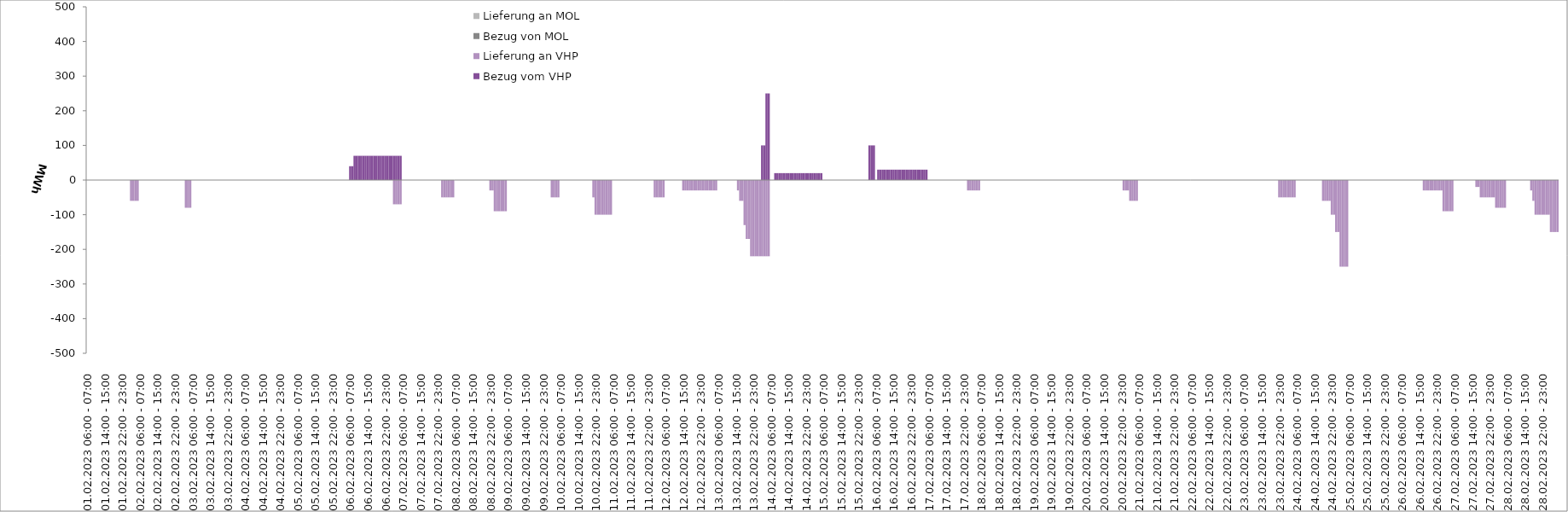
| Category | Bezug vom VHP | Lieferung an VHP | Bezug von MOL | Lieferung an MOL |
|---|---|---|---|---|
| 01.02.2023 06:00 - 07:00 | 0 | 0 | 0 | 0 |
| 01.02.2023 07:00 - 08:00 | 0 | 0 | 0 | 0 |
| 01.02.2023 08:00 - 09:00 | 0 | 0 | 0 | 0 |
| 01.02.2023 09:00 - 10:00 | 0 | 0 | 0 | 0 |
| 01.02.2023 10:00 - 11:00 | 0 | 0 | 0 | 0 |
| 01.02.2023 11:00 - 12:00 | 0 | 0 | 0 | 0 |
| 01.02.2023 12:00 - 13:00 | 0 | 0 | 0 | 0 |
| 01.02.2023 13:00 - 14:00 | 0 | 0 | 0 | 0 |
| 01.02.2023 14:00 - 15:00 | 0 | 0 | 0 | 0 |
| 01.02.2023 15:00 - 16:00 | 0 | 0 | 0 | 0 |
| 01.02.2023 16:00 - 17:00 | 0 | 0 | 0 | 0 |
| 01.02.2023 17:00 - 18:00 | 0 | 0 | 0 | 0 |
| 01.02.2023 18:00 - 19:00 | 0 | 0 | 0 | 0 |
| 01.02.2023 19:00 - 20:00 | 0 | 0 | 0 | 0 |
| 01.02.2023 20:00 - 21:00 | 0 | 0 | 0 | 0 |
| 01.02.2023 21:00 - 22:00 | 0 | 0 | 0 | 0 |
| 01.02.2023 22:00 - 23:00 | 0 | 0 | 0 | 0 |
| 01.02.2023 23:00 - 24:00 | 0 | 0 | 0 | 0 |
| 02.02.2023 00:00 - 01:00 | 0 | 0 | 0 | 0 |
| 02.02.2023 01:00 - 02:00 | 0 | 0 | 0 | 0 |
| 02.02.2023 02:00 - 03:00 | 0 | -60 | 0 | 0 |
| 02.02.2023 03:00 - 04:00 | 0 | -60 | 0 | 0 |
| 02.02.2023 04:00 - 05:00 | 0 | -60 | 0 | 0 |
| 02.02.2023 05:00 - 06:00 | 0 | -60 | 0 | 0 |
| 02.02.2023 06:00 - 07:00 | 0 | 0 | 0 | 0 |
| 02.02.2023 07:00 - 08:00 | 0 | 0 | 0 | 0 |
| 02.02.2023 08:00 - 09:00 | 0 | 0 | 0 | 0 |
| 02.02.2023 09:00 - 10:00 | 0 | 0 | 0 | 0 |
| 02.02.2023 10:00 - 11:00 | 0 | 0 | 0 | 0 |
| 02.02.2023 11:00 - 12:00 | 0 | 0 | 0 | 0 |
| 02.02.2023 12:00 - 13:00 | 0 | 0 | 0 | 0 |
| 02.02.2023 13:00 - 14:00 | 0 | 0 | 0 | 0 |
| 02.02.2023 14:00 - 15:00 | 0 | 0 | 0 | 0 |
| 02.02.2023 15:00 - 16:00 | 0 | 0 | 0 | 0 |
| 02.02.2023 16:00 - 17:00 | 0 | 0 | 0 | 0 |
| 02.02.2023 17:00 - 18:00 | 0 | 0 | 0 | 0 |
| 02.02.2023 18:00 - 19:00 | 0 | 0 | 0 | 0 |
| 02.02.2023 19:00 - 20:00 | 0 | 0 | 0 | 0 |
| 02.02.2023 20:00 - 21:00 | 0 | 0 | 0 | 0 |
| 02.02.2023 21:00 - 22:00 | 0 | 0 | 0 | 0 |
| 02.02.2023 22:00 - 23:00 | 0 | 0 | 0 | 0 |
| 02.02.2023 23:00 - 24:00 | 0 | 0 | 0 | 0 |
| 03.02.2023 00:00 - 01:00 | 0 | 0 | 0 | 0 |
| 03.02.2023 01:00 - 02:00 | 0 | 0 | 0 | 0 |
| 03.02.2023 02:00 - 03:00 | 0 | 0 | 0 | 0 |
| 03.02.2023 03:00 - 04:00 | 0 | -80 | 0 | 0 |
| 03.02.2023 04:00 - 05:00 | 0 | -80 | 0 | 0 |
| 03.02.2023 05:00 - 06:00 | 0 | -80 | 0 | 0 |
| 03.02.2023 06:00 - 07:00 | 0 | 0 | 0 | 0 |
| 03.02.2023 07:00 - 08:00 | 0 | 0 | 0 | 0 |
| 03.02.2023 08:00 - 09:00 | 0 | 0 | 0 | 0 |
| 03.02.2023 09:00 - 10:00 | 0 | 0 | 0 | 0 |
| 03.02.2023 10:00 - 11:00 | 0 | 0 | 0 | 0 |
| 03.02.2023 11:00 - 12:00 | 0 | 0 | 0 | 0 |
| 03.02.2023 12:00 - 13:00 | 0 | 0 | 0 | 0 |
| 03.02.2023 13:00 - 14:00 | 0 | 0 | 0 | 0 |
| 03.02.2023 14:00 - 15:00 | 0 | 0 | 0 | 0 |
| 03.02.2023 15:00 - 16:00 | 0 | 0 | 0 | 0 |
| 03.02.2023 16:00 - 17:00 | 0 | 0 | 0 | 0 |
| 03.02.2023 17:00 - 18:00 | 0 | 0 | 0 | 0 |
| 03.02.2023 18:00 - 19:00 | 0 | 0 | 0 | 0 |
| 03.02.2023 19:00 - 20:00 | 0 | 0 | 0 | 0 |
| 03.02.2023 20:00 - 21:00 | 0 | 0 | 0 | 0 |
| 03.02.2023 21:00 - 22:00 | 0 | 0 | 0 | 0 |
| 03.02.2023 22:00 - 23:00 | 0 | 0 | 0 | 0 |
| 03.02.2023 23:00 - 24:00 | 0 | 0 | 0 | 0 |
| 04.02.2023 00:00 - 01:00 | 0 | 0 | 0 | 0 |
| 04.02.2023 01:00 - 02:00 | 0 | 0 | 0 | 0 |
| 04.02.2023 02:00 - 03:00 | 0 | 0 | 0 | 0 |
| 04.02.2023 03:00 - 04:00 | 0 | 0 | 0 | 0 |
| 04.02.2023 04:00 - 05:00 | 0 | 0 | 0 | 0 |
| 04.02.2023 05:00 - 06:00 | 0 | 0 | 0 | 0 |
| 04.02.2023 06:00 - 07:00 | 0 | 0 | 0 | 0 |
| 04.02.2023 07:00 - 08:00 | 0 | 0 | 0 | 0 |
| 04.02.2023 08:00 - 09:00 | 0 | 0 | 0 | 0 |
| 04.02.2023 09:00 - 10:00 | 0 | 0 | 0 | 0 |
| 04.02.2023 10:00 - 11:00 | 0 | 0 | 0 | 0 |
| 04.02.2023 11:00 - 12:00 | 0 | 0 | 0 | 0 |
| 04.02.2023 12:00 - 13:00 | 0 | 0 | 0 | 0 |
| 04.02.2023 13:00 - 14:00 | 0 | 0 | 0 | 0 |
| 04.02.2023 14:00 - 15:00 | 0 | 0 | 0 | 0 |
| 04.02.2023 15:00 - 16:00 | 0 | 0 | 0 | 0 |
| 04.02.2023 16:00 - 17:00 | 0 | 0 | 0 | 0 |
| 04.02.2023 17:00 - 18:00 | 0 | 0 | 0 | 0 |
| 04.02.2023 18:00 - 19:00 | 0 | 0 | 0 | 0 |
| 04.02.2023 19:00 - 20:00 | 0 | 0 | 0 | 0 |
| 04.02.2023 20:00 - 21:00 | 0 | 0 | 0 | 0 |
| 04.02.2023 21:00 - 22:00 | 0 | 0 | 0 | 0 |
| 04.02.2023 22:00 - 23:00 | 0 | 0 | 0 | 0 |
| 04.02.2023 23:00 - 24:00 | 0 | 0 | 0 | 0 |
| 05.02.2023 00:00 - 01:00 | 0 | 0 | 0 | 0 |
| 05.02.2023 01:00 - 02:00 | 0 | 0 | 0 | 0 |
| 05.02.2023 02:00 - 03:00 | 0 | 0 | 0 | 0 |
| 05.02.2023 03:00 - 04:00 | 0 | 0 | 0 | 0 |
| 05.02.2023 04:00 - 05:00 | 0 | 0 | 0 | 0 |
| 05.02.2023 05:00 - 06:00 | 0 | 0 | 0 | 0 |
| 05.02.2023 06:00 - 07:00 | 0 | 0 | 0 | 0 |
| 05.02.2023 07:00 - 08:00 | 0 | 0 | 0 | 0 |
| 05.02.2023 08:00 - 09:00 | 0 | 0 | 0 | 0 |
| 05.02.2023 09:00 - 10:00 | 0 | 0 | 0 | 0 |
| 05.02.2023 10:00 - 11:00 | 0 | 0 | 0 | 0 |
| 05.02.2023 11:00 - 12:00 | 0 | 0 | 0 | 0 |
| 05.02.2023 12:00 - 13:00 | 0 | 0 | 0 | 0 |
| 05.02.2023 13:00 - 14:00 | 0 | 0 | 0 | 0 |
| 05.02.2023 14:00 - 15:00 | 0 | 0 | 0 | 0 |
| 05.02.2023 15:00 - 16:00 | 0 | 0 | 0 | 0 |
| 05.02.2023 16:00 - 17:00 | 0 | 0 | 0 | 0 |
| 05.02.2023 17:00 - 18:00 | 0 | 0 | 0 | 0 |
| 05.02.2023 18:00 - 19:00 | 0 | 0 | 0 | 0 |
| 05.02.2023 19:00 - 20:00 | 0 | 0 | 0 | 0 |
| 05.02.2023 20:00 - 21:00 | 0 | 0 | 0 | 0 |
| 05.02.2023 21:00 - 22:00 | 0 | 0 | 0 | 0 |
| 05.02.2023 22:00 - 23:00 | 0 | 0 | 0 | 0 |
| 05.02.2023 23:00 - 24:00 | 0 | 0 | 0 | 0 |
| 06.02.2023 00:00 - 01:00 | 0 | 0 | 0 | 0 |
| 06.02.2023 01:00 - 02:00 | 0 | 0 | 0 | 0 |
| 06.02.2023 02:00 - 03:00 | 0 | 0 | 0 | 0 |
| 06.02.2023 03:00 - 04:00 | 0 | 0 | 0 | 0 |
| 06.02.2023 04:00 - 05:00 | 0 | 0 | 0 | 0 |
| 06.02.2023 05:00 - 06:00 | 0 | 0 | 0 | 0 |
| 06.02.2023 06:00 - 07:00 | 40 | 0 | 0 | 0 |
| 06.02.2023 07:00 - 08:00 | 40 | 0 | 0 | 0 |
| 06.02.2023 08:00 - 09:00 | 70 | 0 | 0 | 0 |
| 06.02.2023 09:00 - 10:00 | 70 | 0 | 0 | 0 |
| 06.02.2023 10:00 - 11:00 | 70 | 0 | 0 | 0 |
| 06.02.2023 11:00 - 12:00 | 70 | 0 | 0 | 0 |
| 06.02.2023 12:00 - 13:00 | 70 | 0 | 0 | 0 |
| 06.02.2023 13:00 - 14:00 | 70 | 0 | 0 | 0 |
| 06.02.2023 14:00 - 15:00 | 70 | 0 | 0 | 0 |
| 06.02.2023 15:00 - 16:00 | 70 | 0 | 0 | 0 |
| 06.02.2023 16:00 - 17:00 | 70 | 0 | 0 | 0 |
| 06.02.2023 17:00 - 18:00 | 70 | 0 | 0 | 0 |
| 06.02.2023 18:00 - 19:00 | 70 | 0 | 0 | 0 |
| 06.02.2023 19:00 - 20:00 | 70 | 0 | 0 | 0 |
| 06.02.2023 20:00 - 21:00 | 70 | 0 | 0 | 0 |
| 06.02.2023 21:00 - 22:00 | 70 | 0 | 0 | 0 |
| 06.02.2023 22:00 - 23:00 | 70 | 0 | 0 | 0 |
| 06.02.2023 23:00 - 24:00 | 70 | 0 | 0 | 0 |
| 07.02.2023 00:00 - 01:00 | 70 | 0 | 0 | 0 |
| 07.02.2023 01:00 - 02:00 | 70 | 0 | 0 | 0 |
| 07.02.2023 02:00 - 03:00 | 70 | -70 | 0 | 0 |
| 07.02.2023 03:00 - 04:00 | 70 | -70 | 0 | 0 |
| 07.02.2023 04:00 - 05:00 | 70 | -70 | 0 | 0 |
| 07.02.2023 05:00 - 06:00 | 70 | -70 | 0 | 0 |
| 07.02.2023 06:00 - 07:00 | 0 | 0 | 0 | 0 |
| 07.02.2023 07:00 - 08:00 | 0 | 0 | 0 | 0 |
| 07.02.2023 08:00 - 09:00 | 0 | 0 | 0 | 0 |
| 07.02.2023 09:00 - 10:00 | 0 | 0 | 0 | 0 |
| 07.02.2023 10:00 - 11:00 | 0 | 0 | 0 | 0 |
| 07.02.2023 11:00 - 12:00 | 0 | 0 | 0 | 0 |
| 07.02.2023 12:00 - 13:00 | 0 | 0 | 0 | 0 |
| 07.02.2023 13:00 - 14:00 | 0 | 0 | 0 | 0 |
| 07.02.2023 14:00 - 15:00 | 0 | 0 | 0 | 0 |
| 07.02.2023 15:00 - 16:00 | 0 | 0 | 0 | 0 |
| 07.02.2023 16:00 - 17:00 | 0 | 0 | 0 | 0 |
| 07.02.2023 17:00 - 18:00 | 0 | 0 | 0 | 0 |
| 07.02.2023 18:00 - 19:00 | 0 | 0 | 0 | 0 |
| 07.02.2023 19:00 - 20:00 | 0 | 0 | 0 | 0 |
| 07.02.2023 20:00 - 21:00 | 0 | 0 | 0 | 0 |
| 07.02.2023 21:00 - 22:00 | 0 | 0 | 0 | 0 |
| 07.02.2023 22:00 - 23:00 | 0 | 0 | 0 | 0 |
| 07.02.2023 23:00 - 24:00 | 0 | 0 | 0 | 0 |
| 08.02.2023 00:00 - 01:00 | 0 | -50 | 0 | 0 |
| 08.02.2023 01:00 - 02:00 | 0 | -50 | 0 | 0 |
| 08.02.2023 02:00 - 03:00 | 0 | -50 | 0 | 0 |
| 08.02.2023 03:00 - 04:00 | 0 | -50 | 0 | 0 |
| 08.02.2023 04:00 - 05:00 | 0 | -50 | 0 | 0 |
| 08.02.2023 05:00 - 06:00 | 0 | -50 | 0 | 0 |
| 08.02.2023 06:00 - 07:00 | 0 | 0 | 0 | 0 |
| 08.02.2023 07:00 - 08:00 | 0 | 0 | 0 | 0 |
| 08.02.2023 08:00 - 09:00 | 0 | 0 | 0 | 0 |
| 08.02.2023 09:00 - 10:00 | 0 | 0 | 0 | 0 |
| 08.02.2023 10:00 - 11:00 | 0 | 0 | 0 | 0 |
| 08.02.2023 11:00 - 12:00 | 0 | 0 | 0 | 0 |
| 08.02.2023 12:00 - 13:00 | 0 | 0 | 0 | 0 |
| 08.02.2023 13:00 - 14:00 | 0 | 0 | 0 | 0 |
| 08.02.2023 14:00 - 15:00 | 0 | 0 | 0 | 0 |
| 08.02.2023 15:00 - 16:00 | 0 | 0 | 0 | 0 |
| 08.02.2023 16:00 - 17:00 | 0 | 0 | 0 | 0 |
| 08.02.2023 17:00 - 18:00 | 0 | 0 | 0 | 0 |
| 08.02.2023 18:00 - 19:00 | 0 | 0 | 0 | 0 |
| 08.02.2023 19:00 - 20:00 | 0 | 0 | 0 | 0 |
| 08.02.2023 20:00 - 21:00 | 0 | 0 | 0 | 0 |
| 08.02.2023 21:00 - 22:00 | 0 | 0 | 0 | 0 |
| 08.02.2023 22:00 - 23:00 | 0 | -30 | 0 | 0 |
| 08.02.2023 23:00 - 24:00 | 0 | -30 | 0 | 0 |
| 09.02.2023 00:00 - 01:00 | 0 | -90 | 0 | 0 |
| 09.02.2023 01:00 - 02:00 | 0 | -90 | 0 | 0 |
| 09.02.2023 02:00 - 03:00 | 0 | -90 | 0 | 0 |
| 09.02.2023 03:00 - 04:00 | 0 | -90 | 0 | 0 |
| 09.02.2023 04:00 - 05:00 | 0 | -90 | 0 | 0 |
| 09.02.2023 05:00 - 06:00 | 0 | -90 | 0 | 0 |
| 09.02.2023 06:00 - 07:00 | 0 | 0 | 0 | 0 |
| 09.02.2023 07:00 - 08:00 | 0 | 0 | 0 | 0 |
| 09.02.2023 08:00 - 09:00 | 0 | 0 | 0 | 0 |
| 09.02.2023 09:00 - 10:00 | 0 | 0 | 0 | 0 |
| 09.02.2023 10:00 - 11:00 | 0 | 0 | 0 | 0 |
| 09.02.2023 11:00 - 12:00 | 0 | 0 | 0 | 0 |
| 09.02.2023 12:00 - 13:00 | 0 | 0 | 0 | 0 |
| 09.02.2023 13:00 - 14:00 | 0 | 0 | 0 | 0 |
| 09.02.2023 14:00 - 15:00 | 0 | 0 | 0 | 0 |
| 09.02.2023 15:00 - 16:00 | 0 | 0 | 0 | 0 |
| 09.02.2023 16:00 - 17:00 | 0 | 0 | 0 | 0 |
| 09.02.2023 17:00 - 18:00 | 0 | 0 | 0 | 0 |
| 09.02.2023 18:00 - 19:00 | 0 | 0 | 0 | 0 |
| 09.02.2023 19:00 - 20:00 | 0 | 0 | 0 | 0 |
| 09.02.2023 20:00 - 21:00 | 0 | 0 | 0 | 0 |
| 09.02.2023 21:00 - 22:00 | 0 | 0 | 0 | 0 |
| 09.02.2023 22:00 - 23:00 | 0 | 0 | 0 | 0 |
| 09.02.2023 23:00 - 24:00 | 0 | 0 | 0 | 0 |
| 10.02.2023 00:00 - 01:00 | 0 | 0 | 0 | 0 |
| 10.02.2023 01:00 - 02:00 | 0 | 0 | 0 | 0 |
| 10.02.2023 02:00 - 03:00 | 0 | -50 | 0 | 0 |
| 10.02.2023 03:00 - 04:00 | 0 | -50 | 0 | 0 |
| 10.02.2023 04:00 - 05:00 | 0 | -50 | 0 | 0 |
| 10.02.2023 05:00 - 06:00 | 0 | -50 | 0 | 0 |
| 10.02.2023 06:00 - 07:00 | 0 | 0 | 0 | 0 |
| 10.02.2023 07:00 - 08:00 | 0 | 0 | 0 | 0 |
| 10.02.2023 08:00 - 09:00 | 0 | 0 | 0 | 0 |
| 10.02.2023 09:00 - 10:00 | 0 | 0 | 0 | 0 |
| 10.02.2023 10:00 - 11:00 | 0 | 0 | 0 | 0 |
| 10.02.2023 11:00 - 12:00 | 0 | 0 | 0 | 0 |
| 10.02.2023 12:00 - 13:00 | 0 | 0 | 0 | 0 |
| 10.02.2023 13:00 - 14:00 | 0 | 0 | 0 | 0 |
| 10.02.2023 14:00 - 15:00 | 0 | 0 | 0 | 0 |
| 10.02.2023 15:00 - 16:00 | 0 | 0 | 0 | 0 |
| 10.02.2023 16:00 - 17:00 | 0 | 0 | 0 | 0 |
| 10.02.2023 17:00 - 18:00 | 0 | 0 | 0 | 0 |
| 10.02.2023 18:00 - 19:00 | 0 | 0 | 0 | 0 |
| 10.02.2023 19:00 - 20:00 | 0 | 0 | 0 | 0 |
| 10.02.2023 20:00 - 21:00 | 0 | 0 | 0 | 0 |
| 10.02.2023 21:00 - 22:00 | 0 | -50 | 0 | 0 |
| 10.02.2023 22:00 - 23:00 | 0 | -100 | 0 | 0 |
| 10.02.2023 23:00 - 24:00 | 0 | -100 | 0 | 0 |
| 11.02.2023 00:00 - 01:00 | 0 | -100 | 0 | 0 |
| 11.02.2023 01:00 - 02:00 | 0 | -100 | 0 | 0 |
| 11.02.2023 02:00 - 03:00 | 0 | -100 | 0 | 0 |
| 11.02.2023 03:00 - 04:00 | 0 | -100 | 0 | 0 |
| 11.02.2023 04:00 - 05:00 | 0 | -100 | 0 | 0 |
| 11.02.2023 05:00 - 06:00 | 0 | -100 | 0 | 0 |
| 11.02.2023 06:00 - 07:00 | 0 | 0 | 0 | 0 |
| 11.02.2023 07:00 - 08:00 | 0 | 0 | 0 | 0 |
| 11.02.2023 08:00 - 09:00 | 0 | 0 | 0 | 0 |
| 11.02.2023 09:00 - 10:00 | 0 | 0 | 0 | 0 |
| 11.02.2023 10:00 - 11:00 | 0 | 0 | 0 | 0 |
| 11.02.2023 11:00 - 12:00 | 0 | 0 | 0 | 0 |
| 11.02.2023 12:00 - 13:00 | 0 | 0 | 0 | 0 |
| 11.02.2023 13:00 - 14:00 | 0 | 0 | 0 | 0 |
| 11.02.2023 14:00 - 15:00 | 0 | 0 | 0 | 0 |
| 11.02.2023 15:00 - 16:00 | 0 | 0 | 0 | 0 |
| 11.02.2023 16:00 - 17:00 | 0 | 0 | 0 | 0 |
| 11.02.2023 17:00 - 18:00 | 0 | 0 | 0 | 0 |
| 11.02.2023 18:00 - 19:00 | 0 | 0 | 0 | 0 |
| 11.02.2023 19:00 - 20:00 | 0 | 0 | 0 | 0 |
| 11.02.2023 20:00 - 21:00 | 0 | 0 | 0 | 0 |
| 11.02.2023 21:00 - 22:00 | 0 | 0 | 0 | 0 |
| 11.02.2023 22:00 - 23:00 | 0 | 0 | 0 | 0 |
| 11.02.2023 23:00 - 24:00 | 0 | 0 | 0 | 0 |
| 12.02.2023 00:00 - 01:00 | 0 | 0 | 0 | 0 |
| 12.02.2023 01:00 - 02:00 | 0 | -50 | 0 | 0 |
| 12.02.2023 02:00 - 03:00 | 0 | -50 | 0 | 0 |
| 12.02.2023 03:00 - 04:00 | 0 | -50 | 0 | 0 |
| 12.02.2023 04:00 - 05:00 | 0 | -50 | 0 | 0 |
| 12.02.2023 05:00 - 06:00 | 0 | -50 | 0 | 0 |
| 12.02.2023 06:00 - 07:00 | 0 | 0 | 0 | 0 |
| 12.02.2023 07:00 - 08:00 | 0 | 0 | 0 | 0 |
| 12.02.2023 08:00 - 09:00 | 0 | 0 | 0 | 0 |
| 12.02.2023 09:00 - 10:00 | 0 | 0 | 0 | 0 |
| 12.02.2023 10:00 - 11:00 | 0 | 0 | 0 | 0 |
| 12.02.2023 11:00 - 12:00 | 0 | 0 | 0 | 0 |
| 12.02.2023 12:00 - 13:00 | 0 | 0 | 0 | 0 |
| 12.02.2023 13:00 - 14:00 | 0 | 0 | 0 | 0 |
| 12.02.2023 14:00 - 15:00 | 0 | -30 | 0 | 0 |
| 12.02.2023 15:00 - 16:00 | 0 | -30 | 0 | 0 |
| 12.02.2023 16:00 - 17:00 | 0 | -30 | 0 | 0 |
| 12.02.2023 17:00 - 18:00 | 0 | -30 | 0 | 0 |
| 12.02.2023 18:00 - 19:00 | 0 | -30 | 0 | 0 |
| 12.02.2023 19:00 - 20:00 | 0 | -30 | 0 | 0 |
| 12.02.2023 20:00 - 21:00 | 0 | -30 | 0 | 0 |
| 12.02.2023 21:00 - 22:00 | 0 | -30 | 0 | 0 |
| 12.02.2023 22:00 - 23:00 | 0 | -30 | 0 | 0 |
| 12.02.2023 23:00 - 24:00 | 0 | -30 | 0 | 0 |
| 13.02.2023 00:00 - 01:00 | 0 | -30 | 0 | 0 |
| 13.02.2023 01:00 - 02:00 | 0 | -30 | 0 | 0 |
| 13.02.2023 02:00 - 03:00 | 0 | -30 | 0 | 0 |
| 13.02.2023 03:00 - 04:00 | 0 | -30 | 0 | 0 |
| 13.02.2023 04:00 - 05:00 | 0 | -30 | 0 | 0 |
| 13.02.2023 05:00 - 06:00 | 0 | -30 | 0 | 0 |
| 13.02.2023 06:00 - 07:00 | 0 | 0 | 0 | 0 |
| 13.02.2023 07:00 - 08:00 | 0 | 0 | 0 | 0 |
| 13.02.2023 08:00 - 09:00 | 0 | 0 | 0 | 0 |
| 13.02.2023 09:00 - 10:00 | 0 | 0 | 0 | 0 |
| 13.02.2023 10:00 - 11:00 | 0 | 0 | 0 | 0 |
| 13.02.2023 11:00 - 12:00 | 0 | 0 | 0 | 0 |
| 13.02.2023 12:00 - 13:00 | 0 | 0 | 0 | 0 |
| 13.02.2023 13:00 - 14:00 | 0 | 0 | 0 | 0 |
| 13.02.2023 14:00 - 15:00 | 0 | 0 | 0 | 0 |
| 13.02.2023 15:00 - 16:00 | 0 | -30 | 0 | 0 |
| 13.02.2023 16:00 - 17:00 | 0 | -60 | 0 | 0 |
| 13.02.2023 17:00 - 18:00 | 0 | -60 | 0 | 0 |
| 13.02.2023 18:00 - 19:00 | 0 | -130 | 0 | 0 |
| 13.02.2023 19:00 - 20:00 | 0 | -170 | 0 | 0 |
| 13.02.2023 20:00 - 21:00 | 0 | -170 | 0 | 0 |
| 13.02.2023 21:00 - 22:00 | 0 | -220 | 0 | 0 |
| 13.02.2023 22:00 - 23:00 | 0 | -220 | 0 | 0 |
| 13.02.2023 23:00 - 24:00 | 0 | -220 | 0 | 0 |
| 14.02.2023 00:00 - 01:00 | 0 | -220 | 0 | 0 |
| 14.02.2023 01:00 - 02:00 | 0 | -220 | 0 | 0 |
| 14.02.2023 02:00 - 03:00 | 100 | -220 | 0 | 0 |
| 14.02.2023 03:00 - 04:00 | 100 | -220 | 0 | 0 |
| 14.02.2023 04:00 - 05:00 | 250 | -220 | 0 | 0 |
| 14.02.2023 05:00 - 06:00 | 250 | -220 | 0 | 0 |
| 14.02.2023 06:00 - 07:00 | 0 | 0 | 0 | 0 |
| 14.02.2023 07:00 - 08:00 | 0 | 0 | 0 | 0 |
| 14.02.2023 08:00 - 09:00 | 20 | 0 | 0 | 0 |
| 14.02.2023 09:00 - 10:00 | 20 | 0 | 0 | 0 |
| 14.02.2023 10:00 - 11:00 | 20 | 0 | 0 | 0 |
| 14.02.2023 11:00 - 12:00 | 20 | 0 | 0 | 0 |
| 14.02.2023 12:00 - 13:00 | 20 | 0 | 0 | 0 |
| 14.02.2023 13:00 - 14:00 | 20 | 0 | 0 | 0 |
| 14.02.2023 14:00 - 15:00 | 20 | 0 | 0 | 0 |
| 14.02.2023 15:00 - 16:00 | 20 | 0 | 0 | 0 |
| 14.02.2023 16:00 - 17:00 | 20 | 0 | 0 | 0 |
| 14.02.2023 17:00 - 18:00 | 20 | 0 | 0 | 0 |
| 14.02.2023 18:00 - 19:00 | 20 | 0 | 0 | 0 |
| 14.02.2023 19:00 - 20:00 | 20 | 0 | 0 | 0 |
| 14.02.2023 20:00 - 21:00 | 20 | 0 | 0 | 0 |
| 14.02.2023 21:00 - 22:00 | 20 | 0 | 0 | 0 |
| 14.02.2023 22:00 - 23:00 | 20 | 0 | 0 | 0 |
| 14.02.2023 23:00 - 24:00 | 20 | 0 | 0 | 0 |
| 15.02.2023 00:00 - 01:00 | 20 | 0 | 0 | 0 |
| 15.02.2023 01:00 - 02:00 | 20 | 0 | 0 | 0 |
| 15.02.2023 02:00 - 03:00 | 20 | 0 | 0 | 0 |
| 15.02.2023 03:00 - 04:00 | 20 | 0 | 0 | 0 |
| 15.02.2023 04:00 - 05:00 | 20 | 0 | 0 | 0 |
| 15.02.2023 05:00 - 06:00 | 20 | 0 | 0 | 0 |
| 15.02.2023 06:00 - 07:00 | 0 | 0 | 0 | 0 |
| 15.02.2023 07:00 - 08:00 | 0 | 0 | 0 | 0 |
| 15.02.2023 08:00 - 09:00 | 0 | 0 | 0 | 0 |
| 15.02.2023 09:00 - 10:00 | 0 | 0 | 0 | 0 |
| 15.02.2023 10:00 - 11:00 | 0 | 0 | 0 | 0 |
| 15.02.2023 11:00 - 12:00 | 0 | 0 | 0 | 0 |
| 15.02.2023 12:00 - 13:00 | 0 | 0 | 0 | 0 |
| 15.02.2023 13:00 - 14:00 | 0 | 0 | 0 | 0 |
| 15.02.2023 14:00 - 15:00 | 0 | 0 | 0 | 0 |
| 15.02.2023 15:00 - 16:00 | 0 | 0 | 0 | 0 |
| 15.02.2023 16:00 - 17:00 | 0 | 0 | 0 | 0 |
| 15.02.2023 17:00 - 18:00 | 0 | 0 | 0 | 0 |
| 15.02.2023 18:00 - 19:00 | 0 | 0 | 0 | 0 |
| 15.02.2023 19:00 - 20:00 | 0 | 0 | 0 | 0 |
| 15.02.2023 20:00 - 21:00 | 0 | 0 | 0 | 0 |
| 15.02.2023 21:00 - 22:00 | 0 | 0 | 0 | 0 |
| 15.02.2023 22:00 - 23:00 | 0 | 0 | 0 | 0 |
| 15.02.2023 23:00 - 24:00 | 0 | 0 | 0 | 0 |
| 16.02.2023 00:00 - 01:00 | 0 | 0 | 0 | 0 |
| 16.02.2023 01:00 - 02:00 | 0 | 0 | 0 | 0 |
| 16.02.2023 02:00 - 03:00 | 0 | 0 | 0 | 0 |
| 16.02.2023 03:00 - 04:00 | 100 | 0 | 0 | 0 |
| 16.02.2023 04:00 - 05:00 | 100 | 0 | 0 | 0 |
| 16.02.2023 05:00 - 06:00 | 100 | 0 | 0 | 0 |
| 16.02.2023 06:00 - 07:00 | 0 | 0 | 0 | 0 |
| 16.02.2023 07:00 - 08:00 | 30 | 0 | 0 | 0 |
| 16.02.2023 08:00 - 09:00 | 30 | 0 | 0 | 0 |
| 16.02.2023 09:00 - 10:00 | 30 | 0 | 0 | 0 |
| 16.02.2023 10:00 - 11:00 | 30 | 0 | 0 | 0 |
| 16.02.2023 11:00 - 12:00 | 30 | 0 | 0 | 0 |
| 16.02.2023 12:00 - 13:00 | 30 | 0 | 0 | 0 |
| 16.02.2023 13:00 - 14:00 | 30 | 0 | 0 | 0 |
| 16.02.2023 14:00 - 15:00 | 30 | 0 | 0 | 0 |
| 16.02.2023 15:00 - 16:00 | 30 | 0 | 0 | 0 |
| 16.02.2023 16:00 - 17:00 | 30 | 0 | 0 | 0 |
| 16.02.2023 17:00 - 18:00 | 30 | 0 | 0 | 0 |
| 16.02.2023 18:00 - 19:00 | 30 | 0 | 0 | 0 |
| 16.02.2023 19:00 - 20:00 | 30 | 0 | 0 | 0 |
| 16.02.2023 20:00 - 21:00 | 30 | 0 | 0 | 0 |
| 16.02.2023 21:00 - 22:00 | 30 | 0 | 0 | 0 |
| 16.02.2023 22:00 - 23:00 | 30 | 0 | 0 | 0 |
| 16.02.2023 23:00 - 24:00 | 30 | 0 | 0 | 0 |
| 17.02.2023 00:00 - 01:00 | 30 | 0 | 0 | 0 |
| 17.02.2023 01:00 - 02:00 | 30 | 0 | 0 | 0 |
| 17.02.2023 02:00 - 03:00 | 30 | 0 | 0 | 0 |
| 17.02.2023 03:00 - 04:00 | 30 | 0 | 0 | 0 |
| 17.02.2023 04:00 - 05:00 | 30 | 0 | 0 | 0 |
| 17.02.2023 05:00 - 06:00 | 30 | 0 | 0 | 0 |
| 17.02.2023 06:00 - 07:00 | 0 | 0 | 0 | 0 |
| 17.02.2023 07:00 - 08:00 | 0 | 0 | 0 | 0 |
| 17.02.2023 08:00 - 09:00 | 0 | 0 | 0 | 0 |
| 17.02.2023 09:00 - 10:00 | 0 | 0 | 0 | 0 |
| 17.02.2023 10:00 - 11:00 | 0 | 0 | 0 | 0 |
| 17.02.2023 11:00 - 12:00 | 0 | 0 | 0 | 0 |
| 17.02.2023 12:00 - 13:00 | 0 | 0 | 0 | 0 |
| 17.02.2023 13:00 - 14:00 | 0 | 0 | 0 | 0 |
| 17.02.2023 14:00 - 15:00 | 0 | 0 | 0 | 0 |
| 17.02.2023 15:00 - 16:00 | 0 | 0 | 0 | 0 |
| 17.02.2023 16:00 - 17:00 | 0 | 0 | 0 | 0 |
| 17.02.2023 17:00 - 18:00 | 0 | 0 | 0 | 0 |
| 17.02.2023 18:00 - 19:00 | 0 | 0 | 0 | 0 |
| 17.02.2023 19:00 - 20:00 | 0 | 0 | 0 | 0 |
| 17.02.2023 20:00 - 21:00 | 0 | 0 | 0 | 0 |
| 17.02.2023 21:00 - 22:00 | 0 | 0 | 0 | 0 |
| 17.02.2023 22:00 - 23:00 | 0 | 0 | 0 | 0 |
| 17.02.2023 23:00 - 24:00 | 0 | 0 | 0 | 0 |
| 18.02.2023 00:00 - 01:00 | 0 | -30 | 0 | 0 |
| 18.02.2023 01:00 - 02:00 | 0 | -30 | 0 | 0 |
| 18.02.2023 02:00 - 03:00 | 0 | -30 | 0 | 0 |
| 18.02.2023 03:00 - 04:00 | 0 | -30 | 0 | 0 |
| 18.02.2023 04:00 - 05:00 | 0 | -30 | 0 | 0 |
| 18.02.2023 05:00 - 06:00 | 0 | -30 | 0 | 0 |
| 18.02.2023 06:00 - 07:00 | 0 | 0 | 0 | 0 |
| 18.02.2023 07:00 - 08:00 | 0 | 0 | 0 | 0 |
| 18.02.2023 08:00 - 09:00 | 0 | 0 | 0 | 0 |
| 18.02.2023 09:00 - 10:00 | 0 | 0 | 0 | 0 |
| 18.02.2023 10:00 - 11:00 | 0 | 0 | 0 | 0 |
| 18.02.2023 11:00 - 12:00 | 0 | 0 | 0 | 0 |
| 18.02.2023 12:00 - 13:00 | 0 | 0 | 0 | 0 |
| 18.02.2023 13:00 - 14:00 | 0 | 0 | 0 | 0 |
| 18.02.2023 14:00 - 15:00 | 0 | 0 | 0 | 0 |
| 18.02.2023 15:00 - 16:00 | 0 | 0 | 0 | 0 |
| 18.02.2023 16:00 - 17:00 | 0 | 0 | 0 | 0 |
| 18.02.2023 17:00 - 18:00 | 0 | 0 | 0 | 0 |
| 18.02.2023 18:00 - 19:00 | 0 | 0 | 0 | 0 |
| 18.02.2023 19:00 - 20:00 | 0 | 0 | 0 | 0 |
| 18.02.2023 20:00 - 21:00 | 0 | 0 | 0 | 0 |
| 18.02.2023 21:00 - 22:00 | 0 | 0 | 0 | 0 |
| 18.02.2023 22:00 - 23:00 | 0 | 0 | 0 | 0 |
| 18.02.2023 23:00 - 24:00 | 0 | 0 | 0 | 0 |
| 19.02.2023 00:00 - 01:00 | 0 | 0 | 0 | 0 |
| 19.02.2023 01:00 - 02:00 | 0 | 0 | 0 | 0 |
| 19.02.2023 02:00 - 03:00 | 0 | 0 | 0 | 0 |
| 19.02.2023 03:00 - 04:00 | 0 | 0 | 0 | 0 |
| 19.02.2023 04:00 - 05:00 | 0 | 0 | 0 | 0 |
| 19.02.2023 05:00 - 06:00 | 0 | 0 | 0 | 0 |
| 19.02.2023 06:00 - 07:00 | 0 | 0 | 0 | 0 |
| 19.02.2023 07:00 - 08:00 | 0 | 0 | 0 | 0 |
| 19.02.2023 08:00 - 09:00 | 0 | 0 | 0 | 0 |
| 19.02.2023 09:00 - 10:00 | 0 | 0 | 0 | 0 |
| 19.02.2023 10:00 - 11:00 | 0 | 0 | 0 | 0 |
| 19.02.2023 11:00 - 12:00 | 0 | 0 | 0 | 0 |
| 19.02.2023 12:00 - 13:00 | 0 | 0 | 0 | 0 |
| 19.02.2023 13:00 - 14:00 | 0 | 0 | 0 | 0 |
| 19.02.2023 14:00 - 15:00 | 0 | 0 | 0 | 0 |
| 19.02.2023 15:00 - 16:00 | 0 | 0 | 0 | 0 |
| 19.02.2023 16:00 - 17:00 | 0 | 0 | 0 | 0 |
| 19.02.2023 17:00 - 18:00 | 0 | 0 | 0 | 0 |
| 19.02.2023 18:00 - 19:00 | 0 | 0 | 0 | 0 |
| 19.02.2023 19:00 - 20:00 | 0 | 0 | 0 | 0 |
| 19.02.2023 20:00 - 21:00 | 0 | 0 | 0 | 0 |
| 19.02.2023 21:00 - 22:00 | 0 | 0 | 0 | 0 |
| 19.02.2023 22:00 - 23:00 | 0 | 0 | 0 | 0 |
| 19.02.2023 23:00 - 24:00 | 0 | 0 | 0 | 0 |
| 20.02.2023 00:00 - 01:00 | 0 | 0 | 0 | 0 |
| 20.02.2023 01:00 - 02:00 | 0 | 0 | 0 | 0 |
| 20.02.2023 02:00 - 03:00 | 0 | 0 | 0 | 0 |
| 20.02.2023 03:00 - 04:00 | 0 | 0 | 0 | 0 |
| 20.02.2023 04:00 - 05:00 | 0 | 0 | 0 | 0 |
| 20.02.2023 05:00 - 06:00 | 0 | 0 | 0 | 0 |
| 20.02.2023 06:00 - 07:00 | 0 | 0 | 0 | 0 |
| 20.02.2023 07:00 - 08:00 | 0 | 0 | 0 | 0 |
| 20.02.2023 08:00 - 09:00 | 0 | 0 | 0 | 0 |
| 20.02.2023 09:00 - 10:00 | 0 | 0 | 0 | 0 |
| 20.02.2023 10:00 - 11:00 | 0 | 0 | 0 | 0 |
| 20.02.2023 11:00 - 12:00 | 0 | 0 | 0 | 0 |
| 20.02.2023 12:00 - 13:00 | 0 | 0 | 0 | 0 |
| 20.02.2023 13:00 - 14:00 | 0 | 0 | 0 | 0 |
| 20.02.2023 14:00 - 15:00 | 0 | 0 | 0 | 0 |
| 20.02.2023 15:00 - 16:00 | 0 | 0 | 0 | 0 |
| 20.02.2023 16:00 - 17:00 | 0 | 0 | 0 | 0 |
| 20.02.2023 17:00 - 18:00 | 0 | 0 | 0 | 0 |
| 20.02.2023 18:00 - 19:00 | 0 | 0 | 0 | 0 |
| 20.02.2023 19:00 - 20:00 | 0 | 0 | 0 | 0 |
| 20.02.2023 20:00 - 21:00 | 0 | 0 | 0 | 0 |
| 20.02.2023 21:00 - 22:00 | 0 | 0 | 0 | 0 |
| 20.02.2023 22:00 - 23:00 | 0 | 0 | 0 | 0 |
| 20.02.2023 23:00 - 24:00 | 0 | -30 | 0 | 0 |
| 21.02.2023 00:00 - 01:00 | 0 | -30 | 0 | 0 |
| 21.02.2023 01:00 - 02:00 | 0 | -30 | 0 | 0 |
| 21.02.2023 02:00 - 03:00 | 0 | -60 | 0 | 0 |
| 21.02.2023 03:00 - 04:00 | 0 | -60 | 0 | 0 |
| 21.02.2023 04:00 - 05:00 | 0 | -60 | 0 | 0 |
| 21.02.2023 05:00 - 06:00 | 0 | -60 | 0 | 0 |
| 21.02.2023 06:00 - 07:00 | 0 | 0 | 0 | 0 |
| 21.02.2023 07:00 - 08:00 | 0 | 0 | 0 | 0 |
| 21.02.2023 08:00 - 09:00 | 0 | 0 | 0 | 0 |
| 21.02.2023 09:00 - 10:00 | 0 | 0 | 0 | 0 |
| 21.02.2023 10:00 - 11:00 | 0 | 0 | 0 | 0 |
| 21.02.2023 11:00 - 12:00 | 0 | 0 | 0 | 0 |
| 21.02.2023 12:00 - 13:00 | 0 | 0 | 0 | 0 |
| 21.02.2023 13:00 - 14:00 | 0 | 0 | 0 | 0 |
| 21.02.2023 14:00 - 15:00 | 0 | 0 | 0 | 0 |
| 21.02.2023 15:00 - 16:00 | 0 | 0 | 0 | 0 |
| 21.02.2023 16:00 - 17:00 | 0 | 0 | 0 | 0 |
| 21.02.2023 17:00 - 18:00 | 0 | 0 | 0 | 0 |
| 21.02.2023 18:00 - 19:00 | 0 | 0 | 0 | 0 |
| 21.02.2023 19:00 - 20:00 | 0 | 0 | 0 | 0 |
| 21.02.2023 20:00 - 21:00 | 0 | 0 | 0 | 0 |
| 21.02.2023 21:00 - 22:00 | 0 | 0 | 0 | 0 |
| 21.02.2023 22:00 - 23:00 | 0 | 0 | 0 | 0 |
| 21.02.2023 23:00 - 24:00 | 0 | 0 | 0 | 0 |
| 22.02.2023 00:00 - 01:00 | 0 | 0 | 0 | 0 |
| 22.02.2023 01:00 - 02:00 | 0 | 0 | 0 | 0 |
| 22.02.2023 02:00 - 03:00 | 0 | 0 | 0 | 0 |
| 22.02.2023 03:00 - 04:00 | 0 | 0 | 0 | 0 |
| 22.02.2023 04:00 - 05:00 | 0 | 0 | 0 | 0 |
| 22.02.2023 05:00 - 06:00 | 0 | 0 | 0 | 0 |
| 22.02.2023 06:00 - 07:00 | 0 | 0 | 0 | 0 |
| 22.02.2023 07:00 - 08:00 | 0 | 0 | 0 | 0 |
| 22.02.2023 08:00 - 09:00 | 0 | 0 | 0 | 0 |
| 22.02.2023 09:00 - 10:00 | 0 | 0 | 0 | 0 |
| 22.02.2023 10:00 - 11:00 | 0 | 0 | 0 | 0 |
| 22.02.2023 11:00 - 12:00 | 0 | 0 | 0 | 0 |
| 22.02.2023 12:00 - 13:00 | 0 | 0 | 0 | 0 |
| 22.02.2023 13:00 - 14:00 | 0 | 0 | 0 | 0 |
| 22.02.2023 14:00 - 15:00 | 0 | 0 | 0 | 0 |
| 22.02.2023 15:00 - 16:00 | 0 | 0 | 0 | 0 |
| 22.02.2023 16:00 - 17:00 | 0 | 0 | 0 | 0 |
| 22.02.2023 17:00 - 18:00 | 0 | 0 | 0 | 0 |
| 22.02.2023 18:00 - 19:00 | 0 | 0 | 0 | 0 |
| 22.02.2023 19:00 - 20:00 | 0 | 0 | 0 | 0 |
| 22.02.2023 20:00 - 21:00 | 0 | 0 | 0 | 0 |
| 22.02.2023 21:00 - 22:00 | 0 | 0 | 0 | 0 |
| 22.02.2023 22:00 - 23:00 | 0 | 0 | 0 | 0 |
| 22.02.2023 23:00 - 24:00 | 0 | 0 | 0 | 0 |
| 23.02.2023 00:00 - 01:00 | 0 | 0 | 0 | 0 |
| 23.02.2023 01:00 - 02:00 | 0 | 0 | 0 | 0 |
| 23.02.2023 02:00 - 03:00 | 0 | 0 | 0 | 0 |
| 23.02.2023 03:00 - 04:00 | 0 | 0 | 0 | 0 |
| 23.02.2023 04:00 - 05:00 | 0 | 0 | 0 | 0 |
| 23.02.2023 05:00 - 06:00 | 0 | 0 | 0 | 0 |
| 23.02.2023 06:00 - 07:00 | 0 | 0 | 0 | 0 |
| 23.02.2023 07:00 - 08:00 | 0 | 0 | 0 | 0 |
| 23.02.2023 08:00 - 09:00 | 0 | 0 | 0 | 0 |
| 23.02.2023 09:00 - 10:00 | 0 | 0 | 0 | 0 |
| 23.02.2023 10:00 - 11:00 | 0 | 0 | 0 | 0 |
| 23.02.2023 11:00 - 12:00 | 0 | 0 | 0 | 0 |
| 23.02.2023 12:00 - 13:00 | 0 | 0 | 0 | 0 |
| 23.02.2023 13:00 - 14:00 | 0 | 0 | 0 | 0 |
| 23.02.2023 14:00 - 15:00 | 0 | 0 | 0 | 0 |
| 23.02.2023 15:00 - 16:00 | 0 | 0 | 0 | 0 |
| 23.02.2023 16:00 - 17:00 | 0 | 0 | 0 | 0 |
| 23.02.2023 17:00 - 18:00 | 0 | 0 | 0 | 0 |
| 23.02.2023 18:00 - 19:00 | 0 | 0 | 0 | 0 |
| 23.02.2023 19:00 - 20:00 | 0 | 0 | 0 | 0 |
| 23.02.2023 20:00 - 21:00 | 0 | 0 | 0 | 0 |
| 23.02.2023 21:00 - 22:00 | 0 | 0 | 0 | 0 |
| 23.02.2023 22:00 - 23:00 | 0 | -50 | 0 | 0 |
| 23.02.2023 23:00 - 24:00 | 0 | -50 | 0 | 0 |
| 24.02.2023 00:00 - 01:00 | 0 | -50 | 0 | 0 |
| 24.02.2023 01:00 - 02:00 | 0 | -50 | 0 | 0 |
| 24.02.2023 02:00 - 03:00 | 0 | -50 | 0 | 0 |
| 24.02.2023 03:00 - 04:00 | 0 | -50 | 0 | 0 |
| 24.02.2023 04:00 - 05:00 | 0 | -50 | 0 | 0 |
| 24.02.2023 05:00 - 06:00 | 0 | -50 | 0 | 0 |
| 24.02.2023 06:00 - 07:00 | 0 | 0 | 0 | 0 |
| 24.02.2023 07:00 - 08:00 | 0 | 0 | 0 | 0 |
| 24.02.2023 08:00 - 09:00 | 0 | 0 | 0 | 0 |
| 24.02.2023 09:00 - 10:00 | 0 | 0 | 0 | 0 |
| 24.02.2023 10:00 - 11:00 | 0 | 0 | 0 | 0 |
| 24.02.2023 11:00 - 12:00 | 0 | 0 | 0 | 0 |
| 24.02.2023 12:00 - 13:00 | 0 | 0 | 0 | 0 |
| 24.02.2023 13:00 - 14:00 | 0 | 0 | 0 | 0 |
| 24.02.2023 14:00 - 15:00 | 0 | 0 | 0 | 0 |
| 24.02.2023 15:00 - 16:00 | 0 | 0 | 0 | 0 |
| 24.02.2023 16:00 - 17:00 | 0 | 0 | 0 | 0 |
| 24.02.2023 17:00 - 18:00 | 0 | 0 | 0 | 0 |
| 24.02.2023 18:00 - 19:00 | 0 | -60 | 0 | 0 |
| 24.02.2023 19:00 - 20:00 | 0 | -60 | 0 | 0 |
| 24.02.2023 20:00 - 21:00 | 0 | -60 | 0 | 0 |
| 24.02.2023 21:00 - 22:00 | 0 | -60 | 0 | 0 |
| 24.02.2023 22:00 - 23:00 | 0 | -100 | 0 | 0 |
| 24.02.2023 23:00 - 24:00 | 0 | -100 | 0 | 0 |
| 25.02.2023 00:00 - 01:00 | 0 | -150 | 0 | 0 |
| 25.02.2023 01:00 - 02:00 | 0 | -150 | 0 | 0 |
| 25.02.2023 02:00 - 03:00 | 0 | -250 | 0 | 0 |
| 25.02.2023 03:00 - 04:00 | 0 | -250 | 0 | 0 |
| 25.02.2023 04:00 - 05:00 | 0 | -250 | 0 | 0 |
| 25.02.2023 05:00 - 06:00 | 0 | -250 | 0 | 0 |
| 25.02.2023 06:00 - 07:00 | 0 | 0 | 0 | 0 |
| 25.02.2023 07:00 - 08:00 | 0 | 0 | 0 | 0 |
| 25.02.2023 08:00 - 09:00 | 0 | 0 | 0 | 0 |
| 25.02.2023 09:00 - 10:00 | 0 | 0 | 0 | 0 |
| 25.02.2023 10:00 - 11:00 | 0 | 0 | 0 | 0 |
| 25.02.2023 11:00 - 12:00 | 0 | 0 | 0 | 0 |
| 25.02.2023 12:00 - 13:00 | 0 | 0 | 0 | 0 |
| 25.02.2023 13:00 - 14:00 | 0 | 0 | 0 | 0 |
| 25.02.2023 14:00 - 15:00 | 0 | 0 | 0 | 0 |
| 25.02.2023 15:00 - 16:00 | 0 | 0 | 0 | 0 |
| 25.02.2023 16:00 - 17:00 | 0 | 0 | 0 | 0 |
| 25.02.2023 17:00 - 18:00 | 0 | 0 | 0 | 0 |
| 25.02.2023 18:00 - 19:00 | 0 | 0 | 0 | 0 |
| 25.02.2023 19:00 - 20:00 | 0 | 0 | 0 | 0 |
| 25.02.2023 20:00 - 21:00 | 0 | 0 | 0 | 0 |
| 25.02.2023 21:00 - 22:00 | 0 | 0 | 0 | 0 |
| 25.02.2023 22:00 - 23:00 | 0 | 0 | 0 | 0 |
| 25.02.2023 23:00 - 24:00 | 0 | 0 | 0 | 0 |
| 26.02.2023 00:00 - 01:00 | 0 | 0 | 0 | 0 |
| 26.02.2023 01:00 - 02:00 | 0 | 0 | 0 | 0 |
| 26.02.2023 02:00 - 03:00 | 0 | 0 | 0 | 0 |
| 26.02.2023 03:00 - 04:00 | 0 | 0 | 0 | 0 |
| 26.02.2023 04:00 - 05:00 | 0 | 0 | 0 | 0 |
| 26.02.2023 05:00 - 06:00 | 0 | 0 | 0 | 0 |
| 26.02.2023 06:00 - 07:00 | 0 | 0 | 0 | 0 |
| 26.02.2023 07:00 - 08:00 | 0 | 0 | 0 | 0 |
| 26.02.2023 08:00 - 09:00 | 0 | 0 | 0 | 0 |
| 26.02.2023 09:00 - 10:00 | 0 | 0 | 0 | 0 |
| 26.02.2023 10:00 - 11:00 | 0 | 0 | 0 | 0 |
| 26.02.2023 11:00 - 12:00 | 0 | 0 | 0 | 0 |
| 26.02.2023 12:00 - 13:00 | 0 | 0 | 0 | 0 |
| 26.02.2023 13:00 - 14:00 | 0 | 0 | 0 | 0 |
| 26.02.2023 14:00 - 15:00 | 0 | 0 | 0 | 0 |
| 26.02.2023 15:00 - 16:00 | 0 | 0 | 0 | 0 |
| 26.02.2023 16:00 - 17:00 | 0 | -30 | 0 | 0 |
| 26.02.2023 17:00 - 18:00 | 0 | -30 | 0 | 0 |
| 26.02.2023 18:00 - 19:00 | 0 | -30 | 0 | 0 |
| 26.02.2023 19:00 - 20:00 | 0 | -30 | 0 | 0 |
| 26.02.2023 20:00 - 21:00 | 0 | -30 | 0 | 0 |
| 26.02.2023 21:00 - 22:00 | 0 | -30 | 0 | 0 |
| 26.02.2023 22:00 - 23:00 | 0 | -30 | 0 | 0 |
| 26.02.2023 23:00 - 24:00 | 0 | -30 | 0 | 0 |
| 27.02.2023 00:00 - 01:00 | 0 | -30 | 0 | 0 |
| 27.02.2023 01:00 - 02:00 | 0 | -90 | 0 | 0 |
| 27.02.2023 02:00 - 03:00 | 0 | -90 | 0 | 0 |
| 27.02.2023 03:00 - 04:00 | 0 | -90 | 0 | 0 |
| 27.02.2023 04:00 - 05:00 | 0 | -90 | 0 | 0 |
| 27.02.2023 05:00 - 06:00 | 0 | -90 | 0 | 0 |
| 27.02.2023 06:00 - 07:00 | 0 | 0 | 0 | 0 |
| 27.02.2023 07:00 - 08:00 | 0 | 0 | 0 | 0 |
| 27.02.2023 08:00 - 09:00 | 0 | 0 | 0 | 0 |
| 27.02.2023 09:00 - 10:00 | 0 | 0 | 0 | 0 |
| 27.02.2023 10:00 - 11:00 | 0 | 0 | 0 | 0 |
| 27.02.2023 11:00 - 12:00 | 0 | 0 | 0 | 0 |
| 27.02.2023 12:00 - 13:00 | 0 | 0 | 0 | 0 |
| 27.02.2023 13:00 - 14:00 | 0 | 0 | 0 | 0 |
| 27.02.2023 14:00 - 15:00 | 0 | 0 | 0 | 0 |
| 27.02.2023 15:00 - 16:00 | 0 | 0 | 0 | 0 |
| 27.02.2023 16:00 - 17:00 | 0 | -20 | 0 | 0 |
| 27.02.2023 17:00 - 18:00 | 0 | -20 | 0 | 0 |
| 27.02.2023 18:00 - 19:00 | 0 | -50 | 0 | 0 |
| 27.02.2023 19:00 - 20:00 | 0 | -50 | 0 | 0 |
| 27.02.2023 20:00 - 21:00 | 0 | -50 | 0 | 0 |
| 27.02.2023 21:00 - 22:00 | 0 | -50 | 0 | 0 |
| 27.02.2023 22:00 - 23:00 | 0 | -50 | 0 | 0 |
| 27.02.2023 23:00 - 24:00 | 0 | -50 | 0 | 0 |
| 28.02.2023 00:00 - 01:00 | 0 | -50 | 0 | 0 |
| 28.02.2023 01:00 - 02:00 | 0 | -80 | 0 | 0 |
| 28.02.2023 02:00 - 03:00 | 0 | -80 | 0 | 0 |
| 28.02.2023 03:00 - 04:00 | 0 | -80 | 0 | 0 |
| 28.02.2023 04:00 - 05:00 | 0 | -80 | 0 | 0 |
| 28.02.2023 05:00 - 06:00 | 0 | -80 | 0 | 0 |
| 28.02.2023 06:00 - 07:00 | 0 | 0 | 0 | 0 |
| 28.02.2023 07:00 - 08:00 | 0 | 0 | 0 | 0 |
| 28.02.2023 08:00 - 09:00 | 0 | 0 | 0 | 0 |
| 28.02.2023 09:00 - 10:00 | 0 | 0 | 0 | 0 |
| 28.02.2023 10:00 - 11:00 | 0 | 0 | 0 | 0 |
| 28.02.2023 11:00 - 12:00 | 0 | 0 | 0 | 0 |
| 28.02.2023 12:00 - 13:00 | 0 | 0 | 0 | 0 |
| 28.02.2023 13:00 - 14:00 | 0 | 0 | 0 | 0 |
| 28.02.2023 14:00 - 15:00 | 0 | 0 | 0 | 0 |
| 28.02.2023 15:00 - 16:00 | 0 | 0 | 0 | 0 |
| 28.02.2023 16:00 - 17:00 | 0 | 0 | 0 | 0 |
| 28.02.2023 17:00 - 18:00 | 0 | -30 | 0 | 0 |
| 28.02.2023 18:00 - 19:00 | 0 | -60 | 0 | 0 |
| 28.02.2023 19:00 - 20:00 | 0 | -100 | 0 | 0 |
| 28.02.2023 20:00 - 21:00 | 0 | -100 | 0 | 0 |
| 28.02.2023 21:00 - 22:00 | 0 | -100 | 0 | 0 |
| 28.02.2023 22:00 - 23:00 | 0 | -100 | 0 | 0 |
| 28.02.2023 23:00 - 24:00 | 0 | -100 | 0 | 0 |
| 01.03.2023 00:00 - 01:00 | 0 | -100 | 0 | 0 |
| 01.03.2023 01:00 - 02:00 | 0 | -100 | 0 | 0 |
| 01.03.2023 02:00 - 03:00 | 0 | -150 | 0 | 0 |
| 01.03.2023 03:00 - 04:00 | 0 | -150 | 0 | 0 |
| 01.03.2023 04:00 - 05:00 | 0 | -150 | 0 | 0 |
| 01.03.2023 05:00 - 06:00 | 0 | -150 | 0 | 0 |